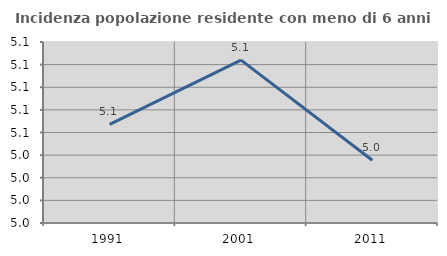
| Category | Incidenza popolazione residente con meno di 6 anni |
|---|---|
| 1991.0 | 5.067 |
| 2001.0 | 5.124 |
| 2011.0 | 5.035 |